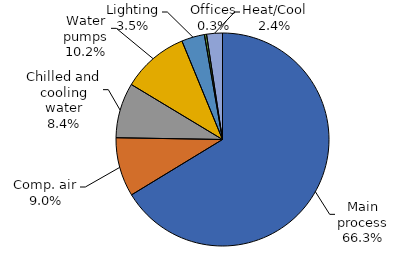
| Category | Series 0 |
|---|---|
| Main process | 0.663 |
| Comp. air | 0.09 |
| Chilled and cooling water | 0.084 |
| Water pumps | 0.101 |
| Lighting | 0.035 |
| Offices | 0.003 |
| Heat/Cool | 0.024 |